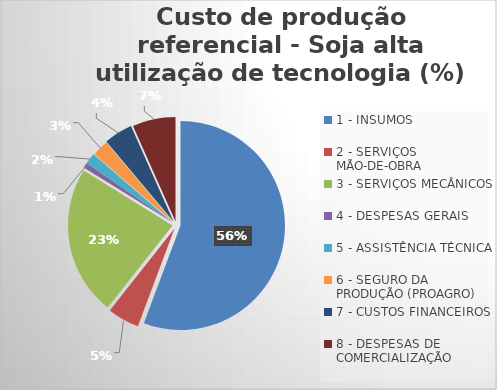
| Category | Series 0 |
|---|---|
| 1 - INSUMOS | 55.704 |
| 2 - SERVIÇOS MÃO-DE-OBRA | 4.923 |
| 3 - SERVIÇOS MECÂNICOS | 23.189 |
| 4 - DESPESAS GERAIS  | 0.838 |
| 5 - ASSISTÊNCIA TÉCNICA | 1.693 |
| 6 - SEGURO DA PRODUÇÃO (PROAGRO) | 2.54 |
| 7 - CUSTOS FINANCEIROS | 4.444 |
| 8 - DESPESAS DE COMERCIALIZAÇÃO | 6.669 |